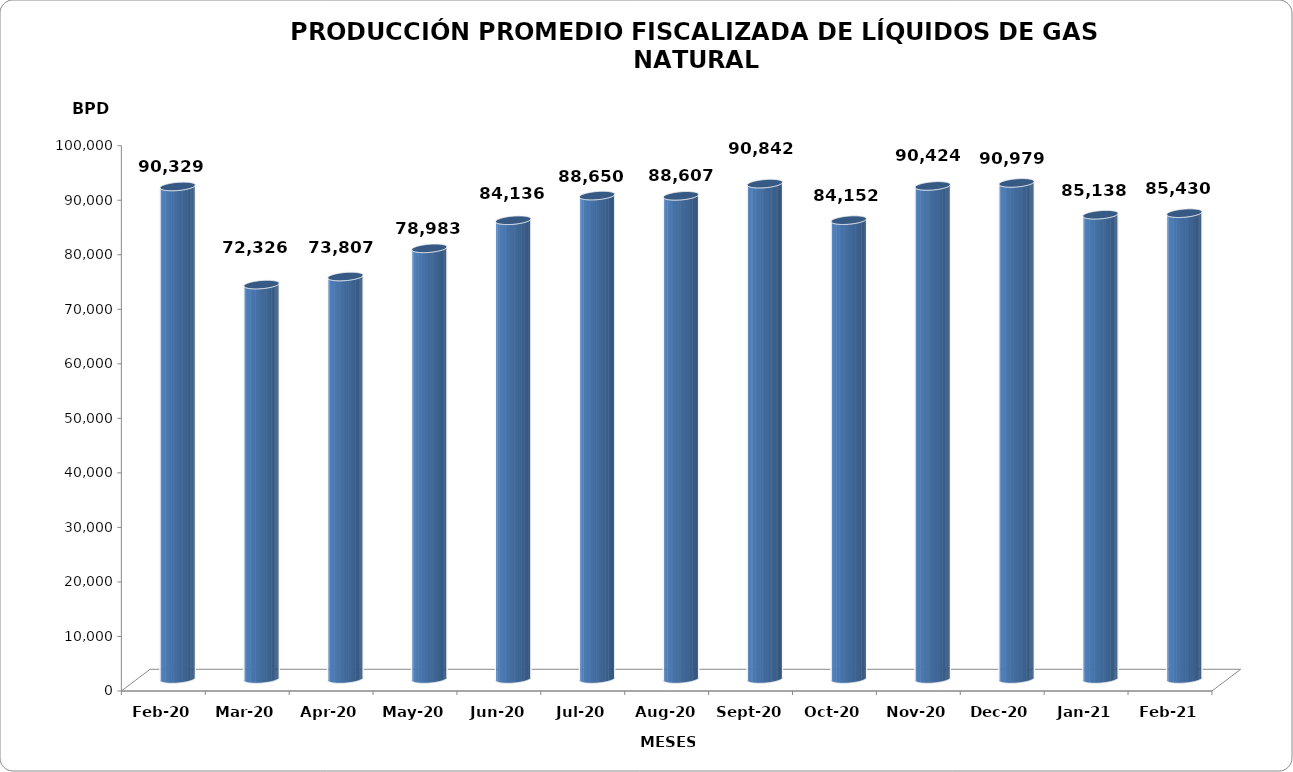
| Category | Series 0 |
|---|---|
| 2020-02-01 | 90329 |
| 2020-03-01 | 72326 |
| 2020-04-01 | 73807 |
| 2020-05-01 | 78983 |
| 2020-06-01 | 84136 |
| 2020-07-01 | 88650 |
| 2020-08-01 | 88607 |
| 2020-09-01 | 90842 |
| 2020-10-01 | 84152 |
| 2020-11-01 | 90424 |
| 2020-12-01 | 90979 |
| 2021-01-01 | 85138 |
| 2021-02-01 | 85430 |